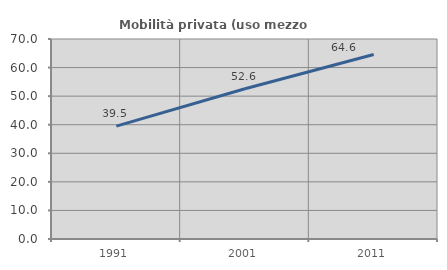
| Category | Mobilità privata (uso mezzo privato) |
|---|---|
| 1991.0 | 39.498 |
| 2001.0 | 52.574 |
| 2011.0 | 64.55 |